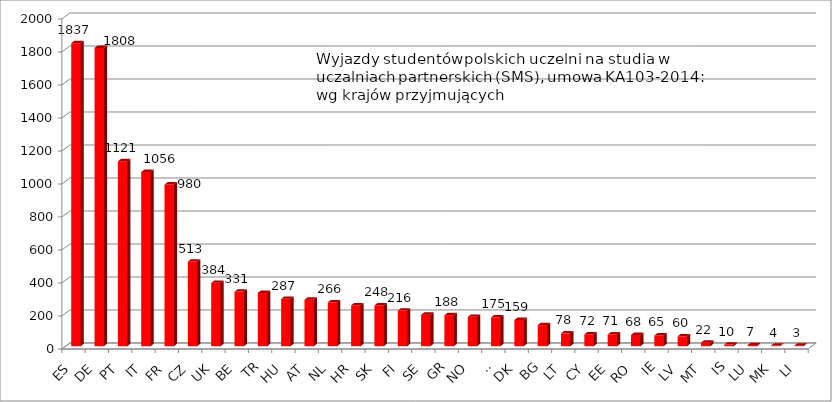
| Category | Series 0 |
|---|---|
| ES | 1837 |
| DE | 1808 |
| PT | 1121 |
| IT | 1056 |
| FR | 980 |
| CZ | 513 |
| UK | 384 |
| BE | 331 |
| TR | 323 |
| HU | 287 |
| AT | 282 |
| NL | 266 |
| HR | 248 |
| SK | 248 |
| FI | 216 |
| SE | 191 |
| GR | 188 |
| NO | 178 |
| SI | 175 |
| DK | 159 |
| BG | 128 |
| LT | 78 |
| CY | 72 |
| EE | 71 |
| RO | 68 |
| IE | 65 |
| LV | 60 |
| MT | 22 |
| IS | 10 |
| LU | 7 |
| MK | 4 |
| LI | 3 |